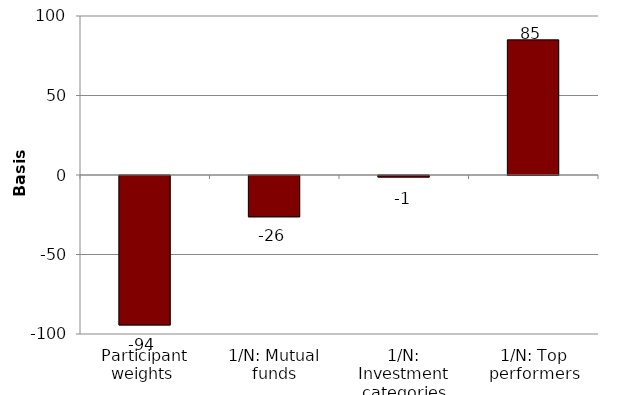
| Category | Series 0 |
|---|---|
| Participant weights  | -94 |
| 1/N: Mutual funds | -26 |
| 1/N: Investment categories | -1 |
| 1/N: Top performers | 85 |